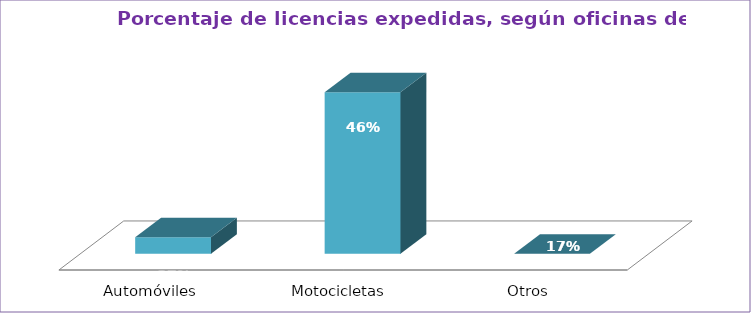
| Category | Series 0 |
|---|---|
| Automóviles  | 9.245 |
| Motocicletas  | 90.755 |
| Otros  | 0 |